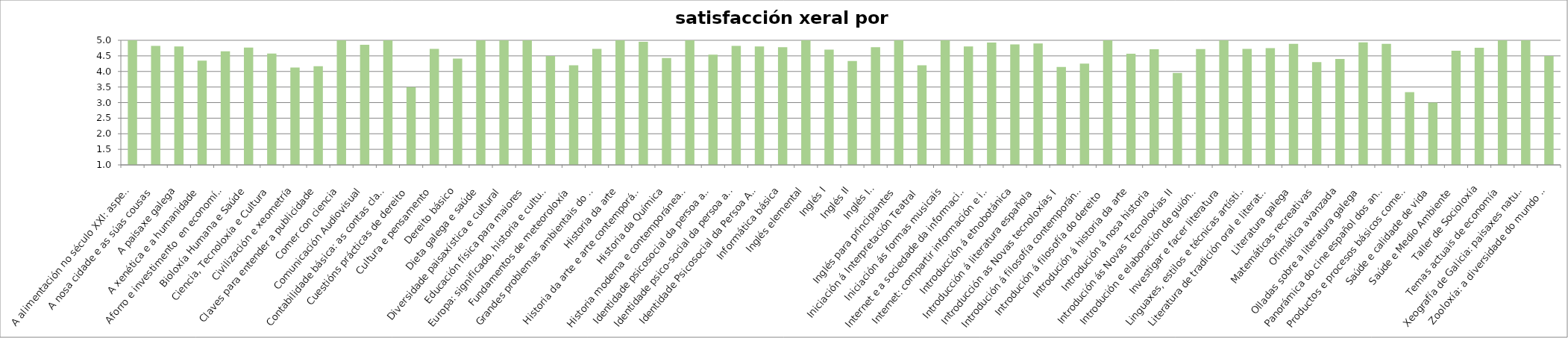
| Category | Satisfacción xeral |
|---|---|
| A alimentación no século XXI: aspectos científicos e prácticos | 5 |
| A nosa cidade e as súas cousas | 4.818 |
| A paisaxe galega | 4.8 |
| A xenética e a humanidade | 4.346 |
| Aforro e investimento  en economías domésticas | 4.647 |
| Bioloxía Humana e Saúde | 4.766 |
| Ciencia, Tecnoloxía e Cultura | 4.577 |
| Civilización e xeometría | 4.125 |
| Claves para entender a publicidade | 4.167 |
| Comer con ciencia | 5 |
| Comunicación Audiovisual | 4.857 |
| Contabilidade básica: as contas claras | 5 |
| Cuestións prácticas de dereito | 3.5 |
| Cultura e pensamento | 4.722 |
| Dereito básico | 4.412 |
| Dieta galega e saúde | 5 |
| Diversidade paisaxística e cultural | 5 |
| Educación física para maiores | 5 |
| Europa: significado, historia e cultura | 4.5 |
| Fundamentos de meteoroloxía | 4.2 |
| Grandes problemas ambientais do noso tempo | 4.727 |
| Historia da arte | 5 |
| Historia da arte e arte contemporánea | 4.95 |
| Historia da Química | 4.429 |
| Historia moderna e contemporánea de España | 5 |
| Identidade psicosocial da persoa adulta | 4.538 |
| Identidade psico-social da persoa adulta | 4.818 |
| Identidade Psicosocial da Persoa Adulta I | 4.8 |
| Informática básica | 4.778 |
| Inglés elemental | 5 |
| Inglés I | 4.7 |
| Inglés II | 4.333 |
| Inglés III | 4.778 |
| Inglés para principiantes | 5 |
| Iniciación á Interpretación Teatral | 4.2 |
| Iniciación ás formas musicais | 5 |
| Internet e a sociedade da información | 4.8 |
| Internet: compartir información e imaxes na rede | 4.929 |
| Introducción á etnobotánica | 4.868 |
| Introducción á literatura española | 4.9 |
| Introducción as Novas tecnoloxías I | 4.143 |
| Introdución á filosofía contemporánea | 4.25 |
| Introdución á filosofía do dereito  | 5 |
| Introdución á historia da arte | 4.571 |
| Introdución á nosa historia | 4.714 |
| Introdución ás Novas Tecnoloxías II | 3.952 |
| Introdución e elaboración de guións cinematográficos | 4.72 |
| Investigar e facer literatura | 5 |
| Linguaxes, estilos e técnicas artísticas | 4.727 |
| Literatura de tradición oral e literatura escrita na cultura galega tradicional | 4.75 |
| Literatura galega | 4.889 |
| Matemáticas recreativas | 4.3 |
| Ofimática avanzada | 4.4 |
| Olladas sobre a literatura galega | 4.933 |
| Panorámica do cine español dos anos 50 | 4.889 |
| Productos e procesos básicos comerciais | 3.333 |
| Saúde e calidade de vida | 3 |
| Saúde e Medio Ambiente | 4.667 |
| Taller de Socioloxía | 4.762 |
| Temas actuais de economía | 5 |
| Xeografía de Galicia: paisaxes naturais e humanas | 5 |
| Zooloxía: a diversidade do mundo animal | 4.5 |